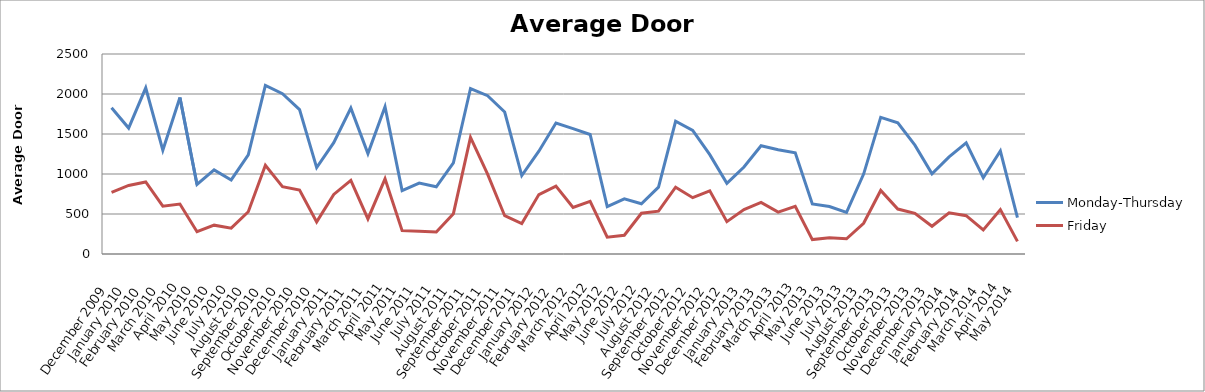
| Category | Monday-Thursday | Friday |
|---|---|---|
| December 2009 | 1827.726 | 771.42 |
| January 2010 | 1573.975 | 856.57 |
| February 2010 | 2076.815 | 900.64 |
| March 2010 | 1297.537 | 597.35 |
| April 2010 | 1955.965 | 625.144 |
| May 2010 | 869.226 | 278.33 |
| June 2010 | 1051.931 | 360.62 |
| July 2010 | 925.722 | 323.648 |
| August 2010 | 1238.958 | 527.8 |
| September 2010 | 2107.127 | 1109.42 |
| October 2010 | 2003.118 | 840.84 |
| November 2010 | 1805.931 | 800.28 |
| December 2010 | 1079.884 | 401.267 |
| January 2011 | 1392.101 | 744.25 |
| February 2011 | 1823.38 | 921.05 |
| March 2011 | 1254.787 | 438.75 |
| April 2011 | 1840.54 | 939.536 |
| May 2011 | 791.624 | 291.98 |
| June 2011 | 886.04 | 282.88 |
| July 2011 | 840.56 | 274.664 |
| August 2011 | 1139.594 | 504.01 |
| September 2011 | 2068.529 | 1456.728 |
| October 2011 | 1979.12 | 998.79 |
| November 2011 | 1774.962 | 478.66 |
| December 2011 | 980.258 | 380.293 |
| January 2012 | 1285.498 | 742.95 |
| February 2012 | 1637.419 | 849.29 |
| March 2012 | 1567 | 582.92 |
| April 2012 | 1493.685 | 658.84 |
| May 2012 | 592.453 | 210.99 |
| June 2012 | 689.488 | 234 |
| July 2012 | 627.915 | 509.21 |
| August 2012 | 836.242 | 535.6 |
| September 2012 | 1659.385 | 835.38 |
| October 2012 | 1544.126 | 704.08 |
| November 2012 | 1241.565 | 789.88 |
| December 2012 | 883.532 | 404.82 |
| January 2013 | 1086.916 | 554.84 |
| February 2013 | 1353.852 | 644.54 |
| March 2013 | 1303.857 | 524.03 |
| April 2013 | 1264.553 | 594.88 |
| May 2013 | 626.6 | 180.128 |
| June 2013 | 593.873 | 202.41 |
| July 2013 | 521.259 | 190.19 |
| August 2013 | 999.195 | 383.76 |
| September 2013 | 1708.46 | 794.56 |
| October 2013 | 1639.341 | 561.73 |
| November 2013 | 1360.905 | 507.936 |
| December 2013 | 1003.392 | 346.58 |
| January 2014 | 1213.129 | 515.944 |
| February 2014 | 1389.765 | 478.53 |
| March 2014 | 952.732 | 300.69 |
| April 2014 | 1287 | 555.62 |
| May 2014 | 455.948 | 158.184 |